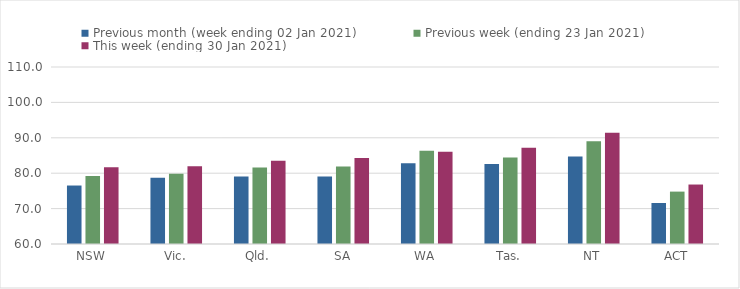
| Category | Previous month (week ending 02 Jan 2021) | Previous week (ending 23 Jan 2021) | This week (ending 30 Jan 2021) |
|---|---|---|---|
| NSW | 76.52 | 79.2 | 81.67 |
| Vic. | 78.69 | 79.82 | 81.99 |
| Qld. | 79.08 | 81.6 | 83.5 |
| SA | 79.09 | 81.9 | 84.28 |
| WA | 82.84 | 86.37 | 86.06 |
| Tas. | 82.62 | 84.46 | 87.2 |
| NT | 84.7 | 89.04 | 91.44 |
| ACT | 71.59 | 74.8 | 76.8 |